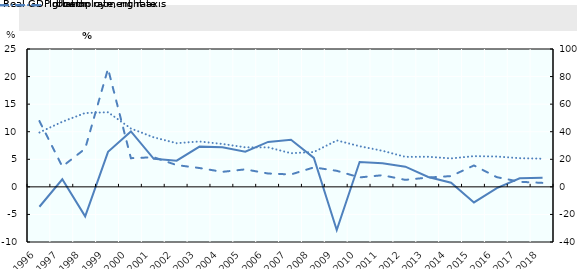
| Category | Real GDP growth | Unemployment rate |
|---|---|---|
| 1996.0 | -3.608 | 9.86 |
| 1997.0 | 1.381 | 11.81 |
| 1998.0 | -5.345 | 13.39 |
| 1999.0 | 6.351 | 13.53 |
| 2000.0 | 10.046 | 10.58 |
| 2001.0 | 5.091 | 8.98 |
| 2002.0 | 4.744 | 7.92 |
| 2003.0 | 7.296 | 8.23 |
| 2004.0 | 7.176 | 7.78 |
| 2005.0 | 6.376 | 7.17 |
| 2006.0 | 8.153 | 7.16 |
| 2007.0 | 8.535 | 6.1 |
| 2008.0 | 5.248 | 6.32 |
| 2009.0 | -7.821 | 8.42 |
| 2010.0 | 4.504 | 7.37 |
| 2011.0 | 4.264 | 6.54 |
| 2012.0 | 3.656 | 5.44 |
| 2013.0 | 1.785 | 5.46 |
| 2014.0 | 0.739 | 5.16 |
| 2015.0 | -2.828 | 5.57 |
| 2016.0 | -0.225 | 5.5 |
| 2017.0 | 1.546 | 5.2 |
| 2018.0 | 1.634 | 5.1 |